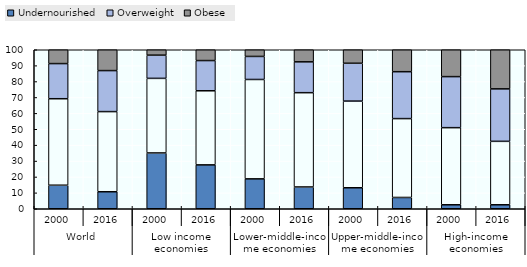
| Category | Undernourished | Series 1 | Overweight | Obese |
|---|---|---|---|---|
| 0 | 14.8 | 54.4 | 22.1 | 8.7 |
| 1 | 10.7 | 50.4 | 25.8 | 13.1 |
| 2 | 35.1 | 46.9 | 14.6 | 3.4 |
| 3 | 27.6 | 46.6 | 19 | 6.8 |
| 4 | 18.8 | 62.5 | 14.5 | 4.2 |
| 5 | 13.7 | 59.3 | 19.4 | 7.6 |
| 6 | 13.2 | 54.5 | 23.8 | 8.5 |
| 7 | 7.1 | 49.6 | 29.5 | 13.8 |
| 8 | 2.5 | 48.5 | 32.1 | 16.9 |
| 9 | 2.5 | 39.9 | 33 | 24.6 |